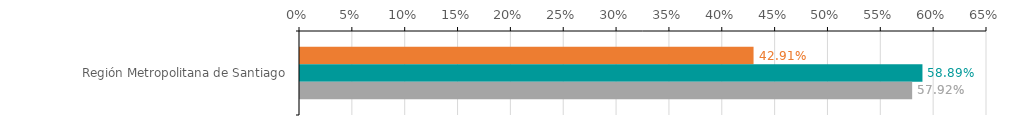
| Category | Numero de operaciones | Monto ($ MM) | Garantia ($ MM) |
|---|---|---|---|
| Región Metropolitana de Santiago | 0.429 | 0.589 | 0.579 |